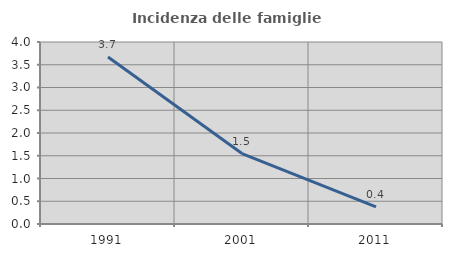
| Category | Incidenza delle famiglie numerose |
|---|---|
| 1991.0 | 3.671 |
| 2001.0 | 1.548 |
| 2011.0 | 0.376 |